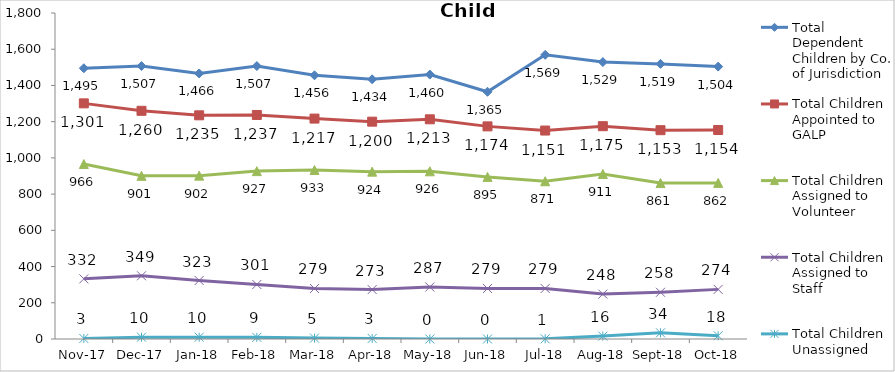
| Category | Total Dependent Children by Co. of Jurisdiction | Total Children Appointed to GALP | Total Children Assigned to Volunteer | Total Children Assigned to Staff | Total Children Unassigned |
|---|---|---|---|---|---|
| 2017-11-01 | 1495 | 1301 | 966 | 332 | 3 |
| 2017-12-01 | 1507 | 1260 | 901 | 349 | 10 |
| 2018-01-01 | 1466 | 1235 | 902 | 323 | 10 |
| 2018-02-01 | 1507 | 1237 | 927 | 301 | 9 |
| 2018-03-01 | 1456 | 1217 | 933 | 279 | 5 |
| 2018-04-01 | 1434 | 1200 | 924 | 273 | 3 |
| 2018-05-01 | 1460 | 1213 | 926 | 287 | 0 |
| 2018-06-01 | 1365 | 1174 | 895 | 279 | 0 |
| 2018-07-01 | 1569 | 1151 | 871 | 279 | 1 |
| 2018-08-01 | 1529 | 1175 | 911 | 248 | 16 |
| 2018-09-01 | 1519 | 1153 | 861 | 258 | 34 |
| 2018-10-01 | 1504 | 1154 | 862 | 274 | 18 |